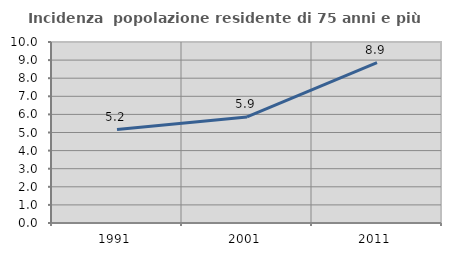
| Category | Incidenza  popolazione residente di 75 anni e più |
|---|---|
| 1991.0 | 5.161 |
| 2001.0 | 5.859 |
| 2011.0 | 8.857 |